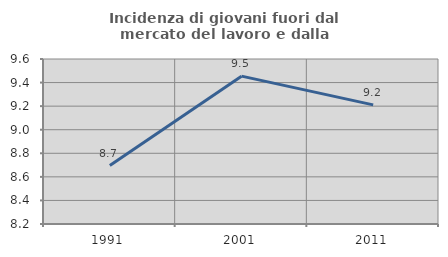
| Category | Incidenza di giovani fuori dal mercato del lavoro e dalla formazione  |
|---|---|
| 1991.0 | 8.696 |
| 2001.0 | 9.455 |
| 2011.0 | 9.211 |